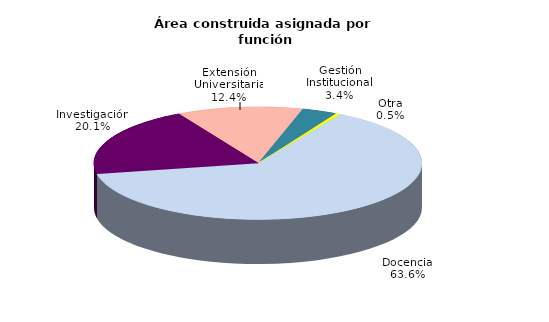
| Category | Series 0 |
|---|---|
| Docencia | 63.572 |
| Investigación | 20.055 |
| Extensión Universitaria | 12.43 |
| Gestión Institucional | 3.446 |
| Otra | 0.499 |